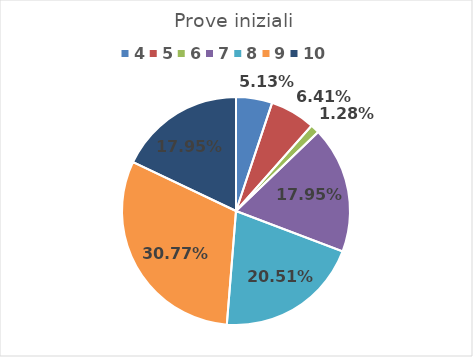
| Category | Series 0 |
|---|---|
| 4.0 | 0.051 |
| 5.0 | 0.064 |
| 6.0 | 0.013 |
| 7.0 | 0.179 |
| 8.0 | 0.205 |
| 9.0 | 0.308 |
| 10.0 | 0.179 |